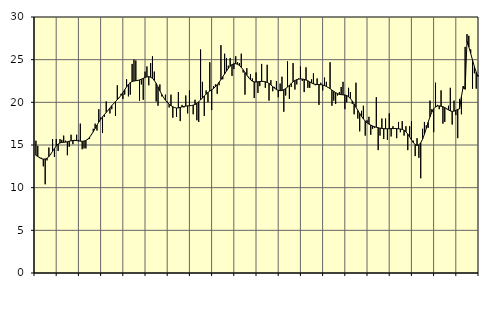
| Category | Piggar | Series 1 |
|---|---|---|
| nan | 15.5 | 13.78 |
| 1.0 | 14.9 | 13.66 |
| 1.0 | 13.6 | 13.5 |
| 1.0 | 13.5 | 13.4 |
| 1.0 | 12.5 | 13.35 |
| 1.0 | 10.4 | 13.36 |
| 1.0 | 13.2 | 13.45 |
| 1.0 | 14.7 | 13.64 |
| 1.0 | 13.9 | 13.93 |
| 1.0 | 15.7 | 14.26 |
| 1.0 | 13.6 | 14.59 |
| 1.0 | 15.7 | 14.89 |
| nan | 14.3 | 15.12 |
| 2.0 | 15.7 | 15.24 |
| 2.0 | 15.6 | 15.3 |
| 2.0 | 16.1 | 15.32 |
| 2.0 | 15.5 | 15.34 |
| 2.0 | 13.8 | 15.38 |
| 2.0 | 14.8 | 15.44 |
| 2.0 | 16.2 | 15.49 |
| 2.0 | 15.1 | 15.52 |
| 2.0 | 15.6 | 15.53 |
| 2.0 | 16.2 | 15.51 |
| 2.0 | 15.6 | 15.48 |
| nan | 17.5 | 15.45 |
| 3.0 | 14.5 | 15.43 |
| 3.0 | 14.6 | 15.46 |
| 3.0 | 14.6 | 15.54 |
| 3.0 | 15.6 | 15.68 |
| 3.0 | 15.7 | 15.91 |
| 3.0 | 16.3 | 16.21 |
| 3.0 | 16.9 | 16.56 |
| 3.0 | 17.5 | 16.94 |
| 3.0 | 16.7 | 17.33 |
| 3.0 | 19.2 | 17.69 |
| 3.0 | 18.2 | 18.01 |
| nan | 16.4 | 18.3 |
| 4.0 | 18.3 | 18.56 |
| 4.0 | 20.1 | 18.81 |
| 4.0 | 19.1 | 19.07 |
| 4.0 | 18.7 | 19.34 |
| 4.0 | 19.2 | 19.61 |
| 4.0 | 19.9 | 19.86 |
| 4.0 | 18.4 | 20.09 |
| 4.0 | 22 | 20.31 |
| 4.0 | 20.5 | 20.55 |
| 4.0 | 21 | 20.82 |
| 4.0 | 20.4 | 21.14 |
| nan | 20.9 | 21.48 |
| 5.0 | 22.7 | 21.81 |
| 5.0 | 20.7 | 22.1 |
| 5.0 | 20.9 | 22.31 |
| 5.0 | 24.5 | 22.44 |
| 5.0 | 25 | 22.5 |
| 5.0 | 24.9 | 22.53 |
| 5.0 | 22.5 | 22.57 |
| 5.0 | 20.2 | 22.63 |
| 5.0 | 22.1 | 22.71 |
| 5.0 | 20.3 | 22.81 |
| 5.0 | 23.6 | 22.91 |
| nan | 24.2 | 22.98 |
| 6.0 | 22 | 23.01 |
| 6.0 | 24.6 | 22.95 |
| 6.0 | 25.4 | 22.81 |
| 6.0 | 23.6 | 22.56 |
| 6.0 | 20.1 | 22.22 |
| 6.0 | 19.6 | 21.81 |
| 6.0 | 22.1 | 21.36 |
| 6.0 | 20.7 | 20.93 |
| 6.0 | 20.6 | 20.56 |
| 6.0 | 20.9 | 20.25 |
| 6.0 | 20.1 | 20 |
| nan | 19.4 | 19.79 |
| 7.0 | 20.9 | 19.61 |
| 7.0 | 18.2 | 19.48 |
| 7.0 | 19.4 | 19.38 |
| 7.0 | 18.3 | 19.33 |
| 7.0 | 21.2 | 19.35 |
| 7.0 | 17.8 | 19.41 |
| 7.0 | 19.7 | 19.47 |
| 7.0 | 19.4 | 19.52 |
| 7.0 | 20.8 | 19.56 |
| 7.0 | 18.7 | 19.58 |
| 7.0 | 21.4 | 19.6 |
| nan | 19.6 | 19.62 |
| 8.0 | 18.6 | 19.67 |
| 8.0 | 20.3 | 19.75 |
| 8.0 | 17.9 | 19.88 |
| 8.0 | 17.7 | 20.07 |
| 8.0 | 26.2 | 20.28 |
| 8.0 | 22.4 | 20.51 |
| 8.0 | 18.4 | 20.75 |
| 8.0 | 21.4 | 20.96 |
| 8.0 | 20 | 21.16 |
| 8.0 | 24.7 | 21.32 |
| 8.0 | 19.1 | 21.47 |
| nan | 21.9 | 21.63 |
| 9.0 | 22.1 | 21.83 |
| 9.0 | 21 | 22.07 |
| 9.0 | 22 | 22.35 |
| 9.0 | 26.7 | 22.67 |
| 9.0 | 22.7 | 23 |
| 9.0 | 25.7 | 23.33 |
| 9.0 | 25.2 | 23.66 |
| 9.0 | 24.3 | 23.98 |
| 9.0 | 25.2 | 24.24 |
| 9.0 | 23.1 | 24.42 |
| 9.0 | 23.9 | 24.52 |
| nan | 25.4 | 24.53 |
| 10.0 | 24.7 | 24.46 |
| 10.0 | 24.6 | 24.32 |
| 10.0 | 25.7 | 24.1 |
| 10.0 | 23.5 | 23.82 |
| 10.0 | 20.9 | 23.5 |
| 10.0 | 24 | 23.18 |
| 10.0 | 23 | 22.88 |
| 10.0 | 23.3 | 22.64 |
| 10.0 | 22.8 | 22.48 |
| 10.0 | 20.5 | 22.4 |
| 10.0 | 23.5 | 22.38 |
| nan | 21.1 | 22.41 |
| 11.0 | 21.9 | 22.44 |
| 11.0 | 24.5 | 22.46 |
| 11.0 | 22.4 | 22.45 |
| 11.0 | 21.7 | 22.41 |
| 11.0 | 24.4 | 22.33 |
| 11.0 | 20.2 | 22.21 |
| 11.0 | 22.6 | 22.04 |
| 11.0 | 21.3 | 21.85 |
| 11.0 | 21.8 | 21.66 |
| 11.0 | 22.5 | 21.5 |
| 11.0 | 20.6 | 21.4 |
| nan | 22.2 | 21.36 |
| 12.0 | 23 | 21.39 |
| 12.0 | 18.9 | 21.48 |
| 12.0 | 20.8 | 21.61 |
| 12.0 | 24.8 | 21.79 |
| 12.0 | 20.4 | 21.99 |
| 12.0 | 21.8 | 22.2 |
| 12.0 | 24.6 | 22.4 |
| 12.0 | 21.5 | 22.56 |
| 12.0 | 22.1 | 22.66 |
| 12.0 | 22.8 | 22.72 |
| 12.0 | 24.2 | 22.74 |
| nan | 22.5 | 22.73 |
| 13.0 | 21.2 | 22.69 |
| 13.0 | 24.1 | 22.61 |
| 13.0 | 21.7 | 22.52 |
| 13.0 | 21.7 | 22.4 |
| 13.0 | 22.7 | 22.27 |
| 13.0 | 23.4 | 22.17 |
| 13.0 | 22 | 22.11 |
| 13.0 | 22.8 | 22.09 |
| 13.0 | 19.7 | 22.08 |
| 13.0 | 22.3 | 22.07 |
| 13.0 | 21.4 | 22.03 |
| nan | 22.9 | 21.96 |
| 14.0 | 22.4 | 21.86 |
| 14.0 | 21.7 | 21.74 |
| 14.0 | 24.7 | 21.6 |
| 14.0 | 19.6 | 21.44 |
| 14.0 | 20.2 | 21.29 |
| 14.0 | 19.8 | 21.14 |
| 14.0 | 20.8 | 21.02 |
| 14.0 | 21.2 | 20.93 |
| 14.0 | 21.8 | 20.9 |
| 14.0 | 22.4 | 20.88 |
| 14.0 | 19.2 | 20.86 |
| nan | 20 | 20.8 |
| 15.0 | 21.7 | 20.66 |
| 15.0 | 21.2 | 20.44 |
| 15.0 | 19.8 | 20.15 |
| 15.0 | 18.6 | 19.81 |
| 15.0 | 22.3 | 19.43 |
| 15.0 | 18.1 | 19.05 |
| 15.0 | 16.6 | 18.69 |
| 15.0 | 19 | 18.36 |
| 15.0 | 19.6 | 18.06 |
| 15.0 | 16.1 | 17.81 |
| 15.0 | 17.9 | 17.6 |
| nan | 18.3 | 17.45 |
| 16.0 | 16.2 | 17.33 |
| 16.0 | 16.9 | 17.23 |
| 16.0 | 17 | 17.14 |
| 16.0 | 20.6 | 17.08 |
| 16.0 | 14.4 | 17.02 |
| 16.0 | 16.1 | 16.97 |
| 16.0 | 18.1 | 16.94 |
| 16.0 | 15.7 | 16.92 |
| 16.0 | 18.1 | 16.9 |
| 16.0 | 15.6 | 16.9 |
| 16.0 | 18.7 | 16.91 |
| nan | 16 | 16.92 |
| 17.0 | 17.2 | 16.92 |
| 17.0 | 16.9 | 16.93 |
| 17.0 | 15.8 | 16.92 |
| 17.0 | 17.7 | 16.9 |
| 17.0 | 16.5 | 16.87 |
| 17.0 | 17.8 | 16.83 |
| 17.0 | 16.1 | 16.73 |
| 17.0 | 17.2 | 16.54 |
| 17.0 | 14.4 | 16.28 |
| 17.0 | 17.2 | 15.95 |
| 17.0 | 17.8 | 15.6 |
| nan | 15.5 | 15.28 |
| 18.0 | 13.7 | 15.05 |
| 18.0 | 15.8 | 14.95 |
| 18.0 | 13.5 | 15.02 |
| 18.0 | 11.1 | 15.26 |
| 18.0 | 16.9 | 15.68 |
| 18.0 | 17.7 | 16.26 |
| 18.0 | 17.3 | 16.94 |
| 18.0 | 17 | 17.65 |
| 18.0 | 20.2 | 18.31 |
| 18.0 | 19.2 | 18.85 |
| 18.0 | 16.5 | 19.23 |
| nan | 22.3 | 19.46 |
| 19.0 | 19.7 | 19.57 |
| 19.0 | 19.2 | 19.58 |
| 19.0 | 21.4 | 19.54 |
| 19.0 | 17.5 | 19.49 |
| 19.0 | 17.7 | 19.39 |
| 19.0 | 19.2 | 19.26 |
| 19.0 | 19.6 | 19.11 |
| 19.0 | 21.7 | 18.99 |
| 19.0 | 17.4 | 18.94 |
| 19.0 | 20.2 | 18.97 |
| 19.0 | 18.5 | 19.06 |
| nan | 15.8 | 19.18 |
| 20.0 | 20.4 | 19.23 |
| 20.0 | 18.6 | 20.68 |
| 20.0 | 21.6 | 21.9 |
| 20.0 | 26.5 | 21.53 |
| 20.0 | 28 | 27.18 |
| 20.0 | 27.8 | 26.51 |
| 20.0 | 26.2 | 25.75 |
| 20.0 | 21.6 | 24.95 |
| 20.0 | 23.4 | 24.19 |
| 20.0 | 21.6 | 23.54 |
| 20.0 | 23.2 | 23.03 |